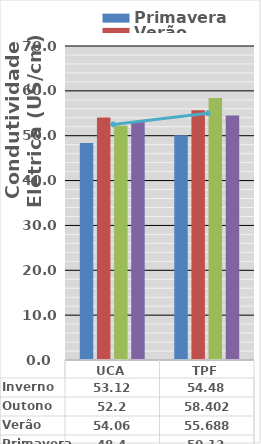
| Category | Primavera | Verão | Outono | Inverno |
|---|---|---|---|---|
| UCA | 48.4 | 54.06 | 52.2 | 53.12 |
| TPF | 50.12 | 55.688 | 58.402 | 54.48 |